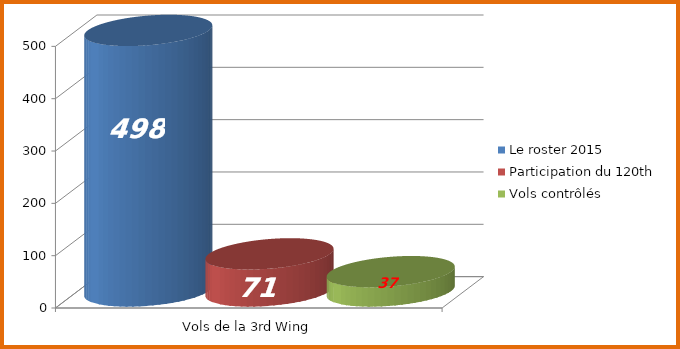
| Category | Le roster 2015 | Participation du 120th | Vols contrôlés |
|---|---|---|---|
| 0 | 498 | 71 | 37 |